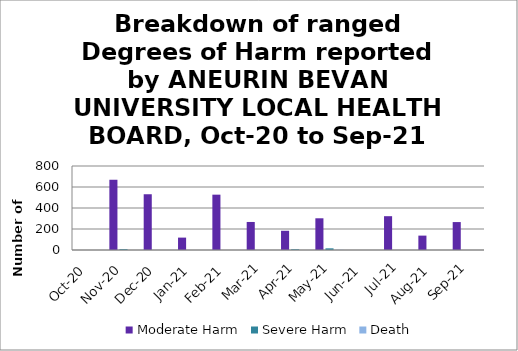
| Category | Moderate Harm | Severe Harm | Death |
|---|---|---|---|
| Oct-20 | 0 | 0 | 0 |
| Nov-20 | 669 | 8 | 0 |
| Dec-20 | 531 | 0 | 0 |
| Jan-21 | 118 | 0 | 0 |
| Feb-21 | 527 | 0 | 0 |
| Mar-21 | 267 | 0 | 0 |
| Apr-21 | 183 | 7 | 0 |
| May-21 | 302 | 16 | 2 |
| Jun-21 | 0 | 0 | 0 |
| Jul-21 | 322 | 0 | 0 |
| Aug-21 | 137 | 0 | 0 |
| Sep-21 | 266 | 0 | 0 |